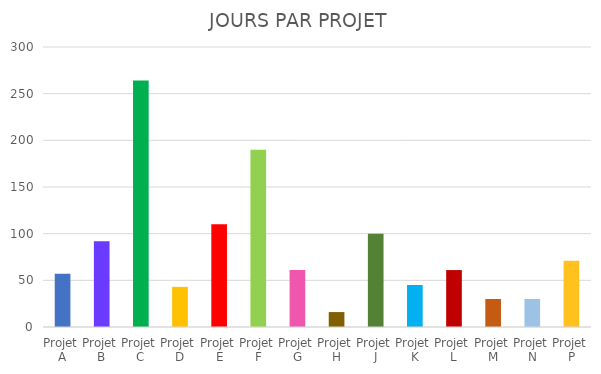
| Category | NB DE JOURS |
|---|---|
| Projet A | 57 |
| Projet B | 92 |
| Projet C | 264 |
| Projet D | 43 |
| Projet E | 110 |
| Projet F | 190 |
| Projet G | 61 |
| Projet H | 16 |
| Projet J | 100 |
| Projet K | 45 |
| Projet L | 61 |
| Projet M | 30 |
| Projet N | 30 |
| Projet P | 71 |